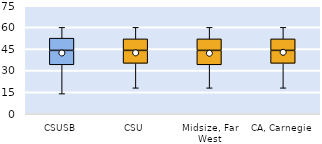
| Category | 25th | 50th | 75th |
|---|---|---|---|
| CSUSB | 34 | 10 | 8.5 |
| CSU | 35 | 9 | 8 |
| Midsize, Far West | 34 | 10 | 8 |
| CA, Carnegie | 35 | 9 | 8 |